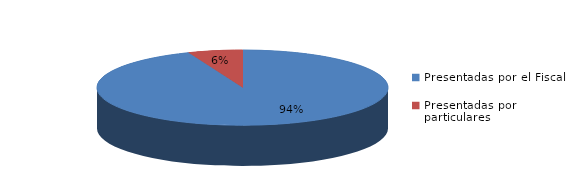
| Category | Series 0 |
|---|---|
| Presentadas por el Fiscal | 109 |
| Presentadas por particulares | 7 |